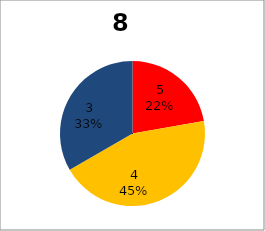
| Category | Series 0 |
|---|---|
| 5.0 | 4 |
| 4.0 | 8 |
| 3.0 | 6 |